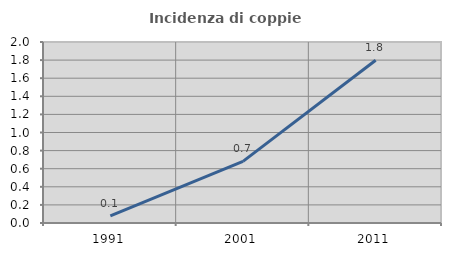
| Category | Incidenza di coppie miste |
|---|---|
| 1991.0 | 0.078 |
| 2001.0 | 0.681 |
| 2011.0 | 1.798 |